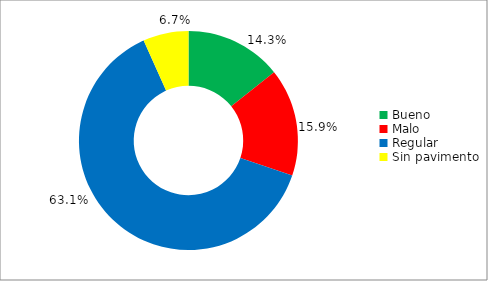
| Category | Series 0 |
|---|---|
| Bueno | 0.143 |
| Malo | 0.159 |
| Regular | 0.631 |
| Sin pavimento | 0.067 |